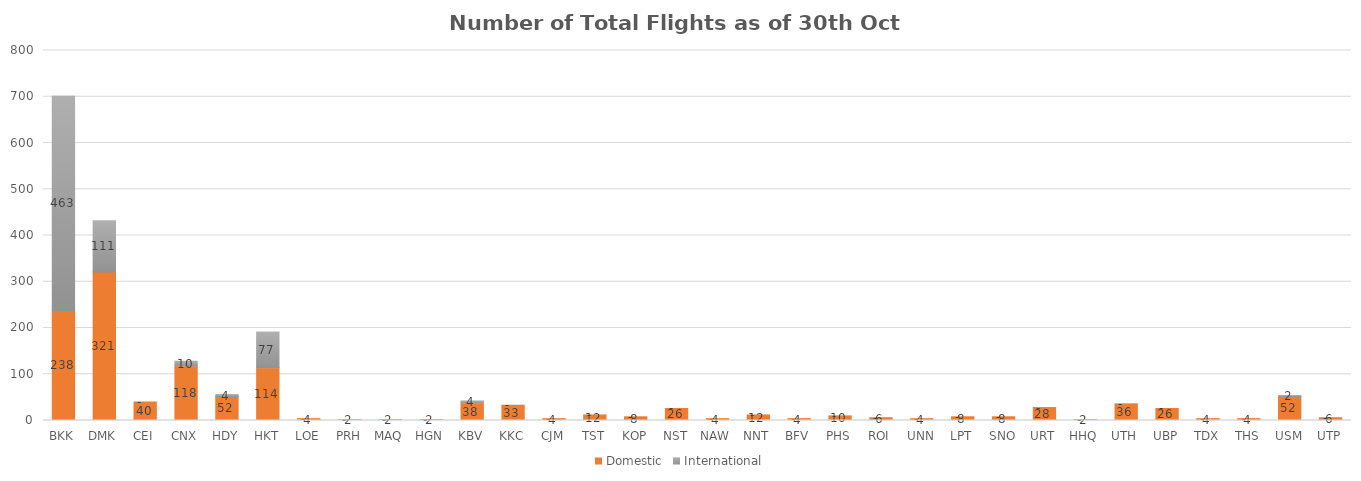
| Category | Domestic | International |
|---|---|---|
| BKK | 238 | 463 |
| DMK | 321 | 111 |
| CEI | 40 | 0 |
| CNX | 118 | 10 |
| HDY | 52 | 4 |
| HKT | 114 | 77 |
| LOE | 4 | 0 |
| PRH | 2 | 0 |
| MAQ | 2 | 0 |
| HGN | 2 | 0 |
| KBV | 38 | 4 |
| KKC | 33 | 0 |
| CJM | 4 | 0 |
| TST | 12 | 0 |
| KOP | 8 | 0 |
| NST | 26 | 0 |
| NAW | 4 | 0 |
| NNT | 12 | 0 |
| BFV | 4 | 0 |
| PHS | 10 | 0 |
| ROI | 6 | 0 |
| UNN | 4 | 0 |
| LPT | 8 | 0 |
| SNO | 8 | 0 |
| URT | 28 | 0 |
| HHQ | 2 | 0 |
| UTH | 36 | 0 |
| UBP | 26 | 0 |
| TDX | 4 | 0 |
| THS | 4 | 0 |
| USM | 52 | 2 |
| UTP | 6 | 0 |